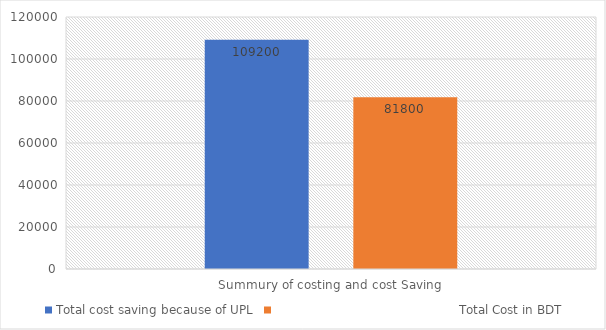
| Category | Total cost saving because of UPL |                                               Total Cost in BDT |
|---|---|---|
| 0 | 109200 | 81800 |